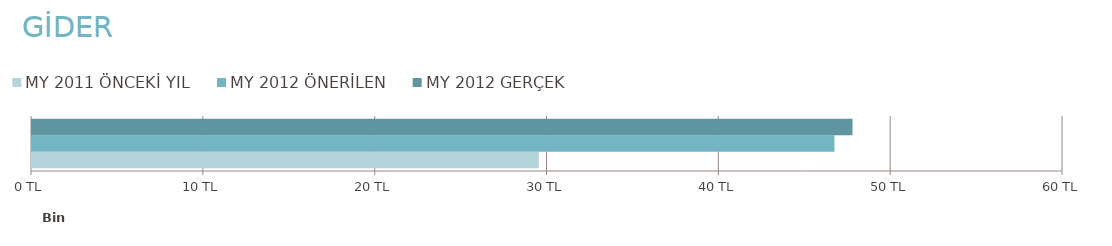
| Category | MY 2011 | MY 2012 |
|---|---|---|
| 0 | 29500 | 47750 |